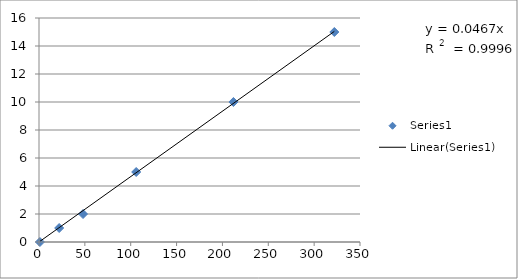
| Category | Series 0 |
|---|---|
| 1.0 | 0 |
| 22.0 | 1 |
| 48.0 | 2 |
| 106.0 | 5 |
| 212.0 | 10 |
| 322.0 | 15 |